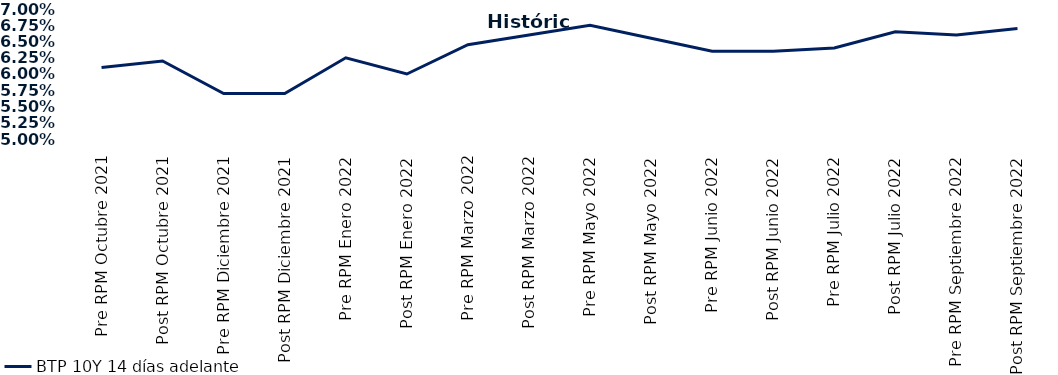
| Category | BTP 10Y 14 días adelante |
|---|---|
| Pre RPM Octubre 2021 | 0.061 |
| Post RPM Octubre 2021 | 0.062 |
| Pre RPM Diciembre 2021 | 0.057 |
| Post RPM Diciembre 2021 | 0.057 |
| Pre RPM Enero 2022 | 0.062 |
| Post RPM Enero 2022 | 0.06 |
| Pre RPM Marzo 2022 | 0.064 |
| Post RPM Marzo 2022 | 0.066 |
| Pre RPM Mayo 2022 | 0.068 |
| Post RPM Mayo 2022 | 0.066 |
| Pre RPM Junio 2022 | 0.064 |
| Post RPM Junio 2022 | 0.064 |
| Pre RPM Julio 2022 | 0.064 |
| Post RPM Julio 2022 | 0.066 |
| Pre RPM Septiembre 2022 | 0.066 |
| Post RPM Septiembre 2022 | 0.067 |